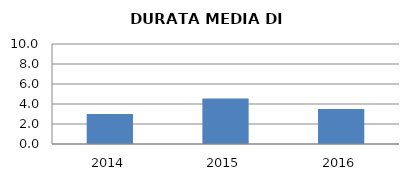
| Category | 2014 2015 2016 |
|---|---|
| 2014.0 | 3 |
| 2015.0 | 4.545 |
| 2016.0 | 3.5 |